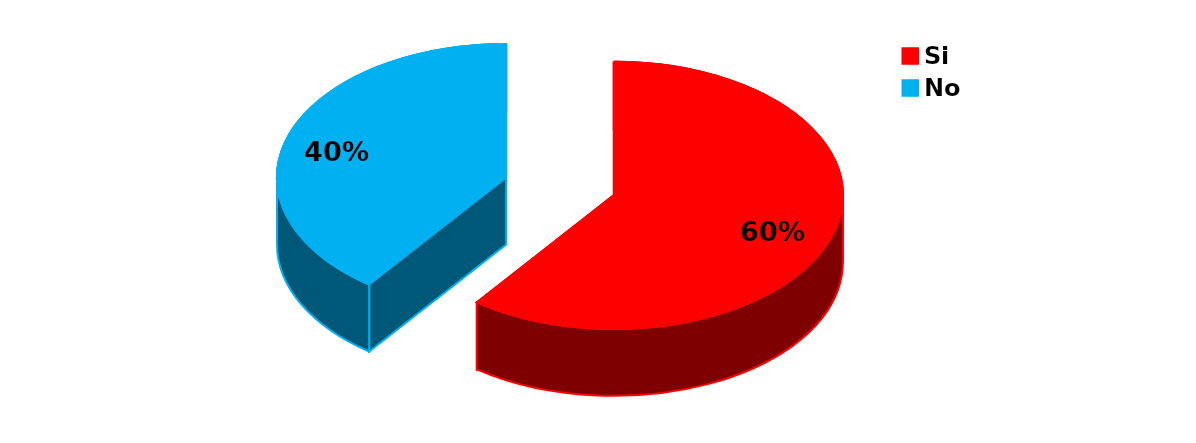
| Category | Series 0 |
|---|---|
| Si | 62 |
| No | 41 |